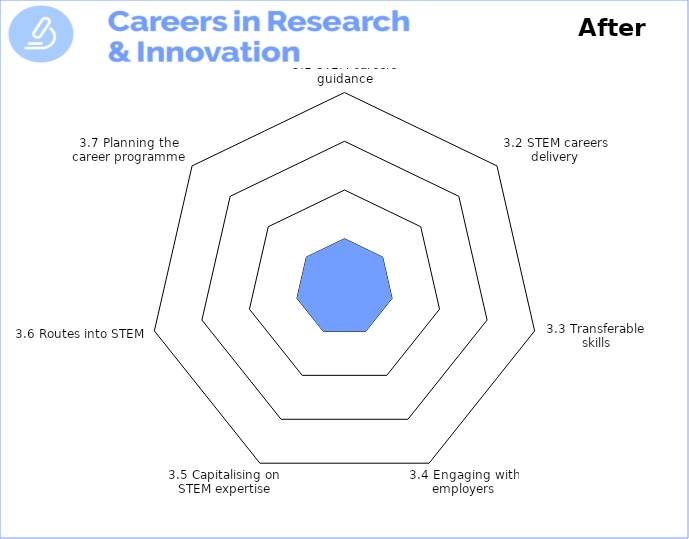
| Category | Theme 1: Leadership, Vision & Culture 

After |
|---|---|
| 3.1 STEM careers guidance | 1 |
| 3.2 STEM careers delivery | 1 |
| 3.3 Transferable 
skills | 1 |
| 3.4 Engaging with employers | 1 |
| 3.5 Capitalising on STEM expertise | 1 |
| 3.6 Routes into STEM | 1 |
| 3.7 Planning the career programme | 1 |